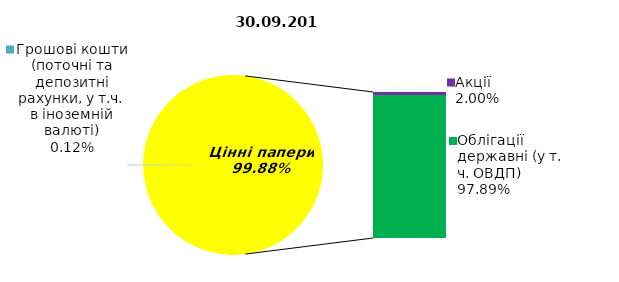
| Category | Series 0 |
|---|---|
| Грошові кошти (поточні та депозитні рахунки, у т.ч. в іноземній валюті) | 0.134 |
| Банківські метали | 0 |
| Нерухомість | 0 |
| Інші активи | 0 |
| Акції | 2.248 |
| Облігації підприємств | 0 |
| Муніципальні облігації | 0 |
| Облігації державні (у т. ч. ОВДП) | 110.311 |
| Іпотечні сертифікати | 0 |